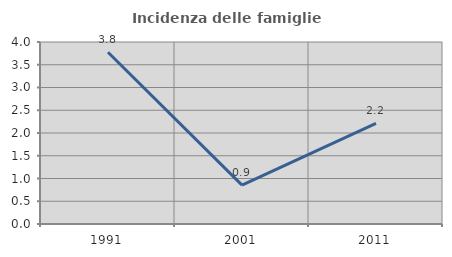
| Category | Incidenza delle famiglie numerose |
|---|---|
| 1991.0 | 3.774 |
| 2001.0 | 0.855 |
| 2011.0 | 2.21 |